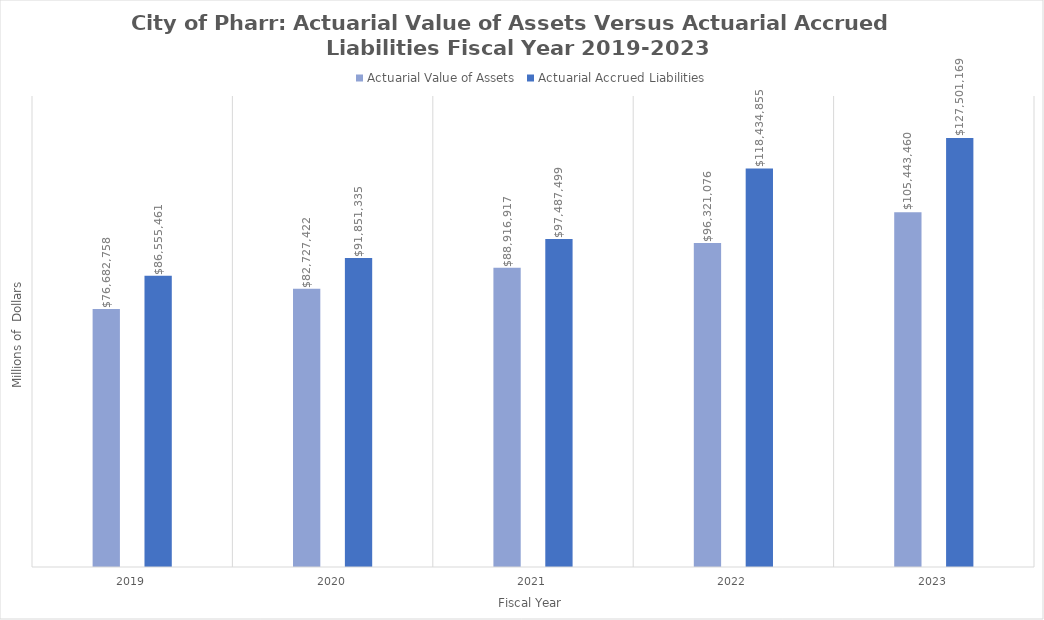
| Category | Actuarial Value of Assets | Actuarial Accrued Liabilities |
|---|---|---|
| 2019.0 | 76682758 | 86555461 |
| 2020.0 | 82727422 | 91851335 |
| 2021.0 | 88916917 | 97487499 |
| 2022.0 | 96321076 | 118434855 |
| 2023.0 | 105443460 | 127501169 |